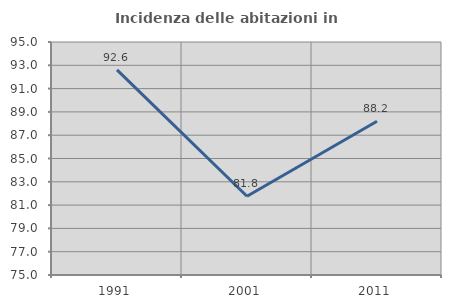
| Category | Incidenza delle abitazioni in proprietà  |
|---|---|
| 1991.0 | 92.614 |
| 2001.0 | 81.757 |
| 2011.0 | 88.194 |